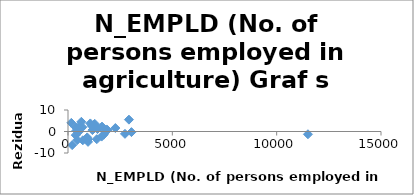
| Category | Series 0 |
|---|---|
| 400.0 | 0.432 |
| 710.0 | -4.092 |
| 1610.0 | -2.364 |
| 500.0 | -0.295 |
| 640.0 | 4.51 |
| 920.0 | -2.739 |
| 1890.0 | 0.633 |
| 3040.0 | -0.289 |
| 2730.0 | -1.084 |
| 1850.0 | 0.945 |
| 2920.0 | 5.511 |
| 1070.0 | 3.757 |
| 160.0 | 4.013 |
| 380.0 | 1.871 |
| 1140.0 | 2.605 |
| 690.0 | 1.996 |
| 1170.0 | 0.655 |
| 1280.0 | 3.566 |
| 2270.0 | 1.606 |
| 960.0 | -4.817 |
| 1710.0 | -1.481 |
| 1410.0 | 1.121 |
| 200.0 | -6.326 |
| 960.0 | -3.697 |
| 11500.0 | -1.285 |
| 1380.0 | -3.569 |
| 530.0 | 2.231 |
| 370.0 | -1.69 |
| 440.0 | -4.005 |
| 1630.0 | 2.279 |